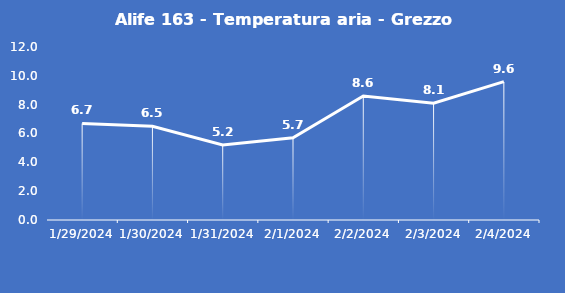
| Category | Alife 163 - Temperatura aria - Grezzo (°C) |
|---|---|
| 1/29/24 | 6.7 |
| 1/30/24 | 6.5 |
| 1/31/24 | 5.2 |
| 2/1/24 | 5.7 |
| 2/2/24 | 8.6 |
| 2/3/24 | 8.1 |
| 2/4/24 | 9.6 |